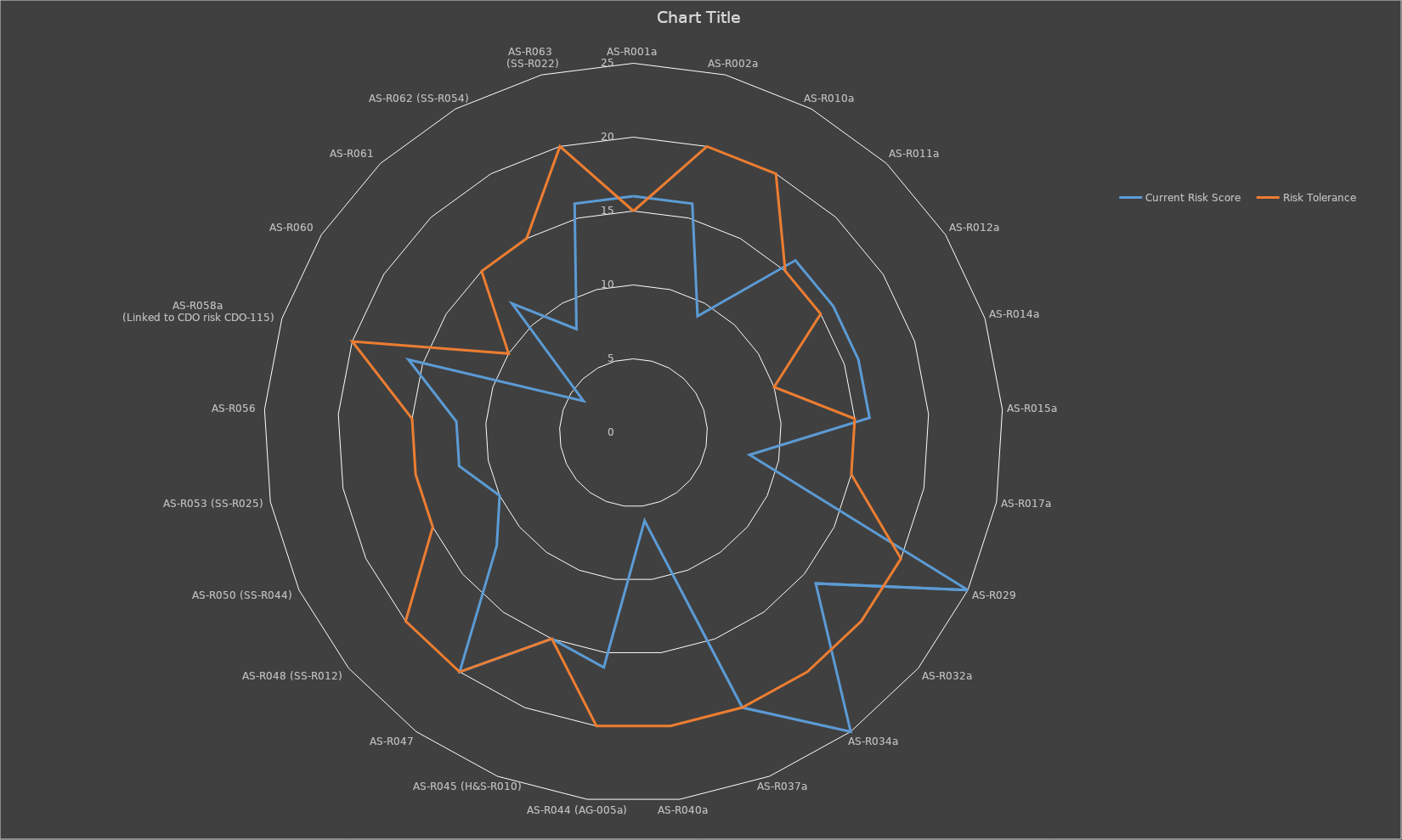
| Category | Current Risk Score | Risk Tolerance |
|---|---|---|
| AS-R001a | 16 | 15 |
| AS-R002a | 16 | 20 |
| AS-R010a | 9 | 20 |
| AS-R011a | 16 | 15 |
| AS-R012a | 16 | 15 |
| AS-R014a | 16 | 10 |
| AS-R015a | 16 | 15 |
| AS-R017a | 8 | 15 |
| AS-R029 | 25 | 20 |
| AS-R032a | 16 | 20 |
| AS-R034a | 25 | 20 |
| AS-R037a | 20 | 20 |
| AS-R040a | 6 | 20 |
| AS-R044 (AG-005a) | 16 | 20 |
| AS-R045 (H&S-R010) | 15 | 15 |
| AS-R047 | 20 | 20 |
| AS-R048 (SS-R012) | 12 | 20 |
| AS-R050 (SS-R044) | 10 | 15 |
| AS-R053 (SS-R025) | 12 | 15 |
| AS-R056 | 12 | 15 |
| AS-R058a 
(Linked to CDO risk CDO-115) | 16 | 20 |
| AS-R060 | 4 | 10 |
| AS-R061 | 12 | 15 |
| AS-R062 (SS-R054) | 8 | 15 |
| AS-R063
 (SS-R022) | 16 | 20 |